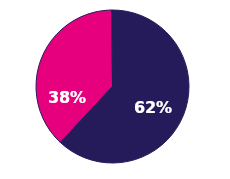
| Category | Series 0 |
|---|---|
| Male | 0.379 |
| Female | 0.621 |